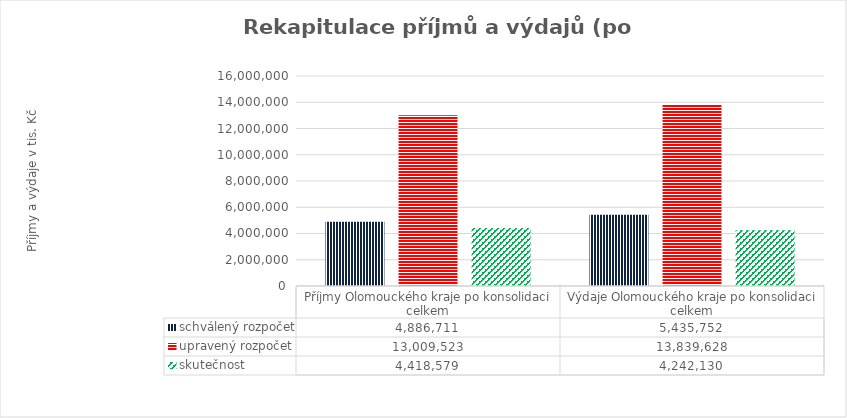
| Category | schválený rozpočet | upravený rozpočet | skutečnost |
|---|---|---|---|
| Příjmy Olomouckého kraje po konsolidaci celkem | 4886711 | 13009523 | 4418579 |
| Výdaje Olomouckého kraje po konsolidaci celkem | 5435752 | 13839628 | 4242130 |